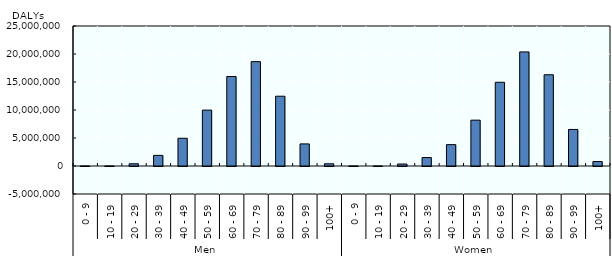
| Category | DALYs |
|---|---|
| 0 | -3.3 |
| 1 | 143.594 |
| 2 | 398194.592 |
| 3 | 1897059.011 |
| 4 | 4954479.686 |
| 5 | 9982994.543 |
| 6 | 15981293.916 |
| 7 | 18636257.141 |
| 8 | 12461043.852 |
| 9 | 3943662.645 |
| 10 | 396234.876 |
| 11 | 65.066 |
| 12 | -50.292 |
| 13 | 351790.805 |
| 14 | 1507160.366 |
| 15 | 3815314.781 |
| 16 | 8185681.67 |
| 17 | 14948403.461 |
| 18 | 20376581.499 |
| 19 | 16295560.262 |
| 20 | 6528883.38 |
| 21 | 795874.328 |